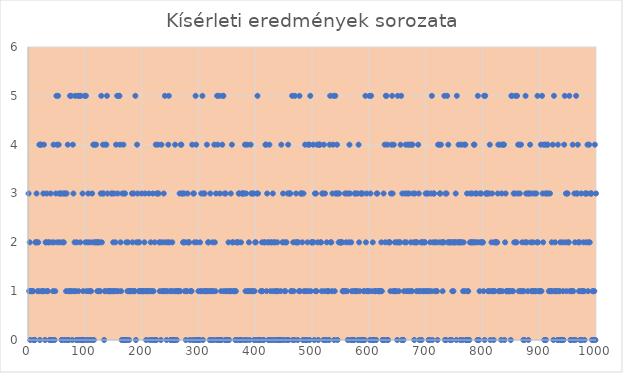
| Category | Series 0 |
|---|---|
| 1.0 | 3 |
| 2.0 | 1 |
| 3.0 | 2 |
| 4.0 | 0 |
| 5.0 | 1 |
| 6.0 | 1 |
| 7.0 | 1 |
| 8.0 | 1 |
| 9.0 | 1 |
| 10.0 | 0 |
| 11.0 | 0 |
| 12.0 | 0 |
| 13.0 | 2 |
| 14.0 | 2 |
| 15.0 | 3 |
| 16.0 | 2 |
| 17.0 | 1 |
| 18.0 | 2 |
| 19.0 | 1 |
| 20.0 | 4 |
| 21.0 | 0 |
| 22.0 | 4 |
| 23.0 | 4 |
| 24.0 | 1 |
| 25.0 | 1 |
| 26.0 | 1 |
| 27.0 | 3 |
| 28.0 | 4 |
| 29.0 | 1 |
| 30.0 | 0 |
| 31.0 | 2 |
| 32.0 | 2 |
| 33.0 | 3 |
| 34.0 | 1 |
| 35.0 | 1 |
| 36.0 | 2 |
| 37.0 | 2 |
| 38.0 | 0 |
| 39.0 | 0 |
| 40.0 | 3 |
| 41.0 | 0 |
| 42.0 | 2 |
| 43.0 | 0 |
| 44.0 | 1 |
| 45.0 | 4 |
| 46.0 | 2 |
| 47.0 | 0 |
| 48.0 | 1 |
| 49.0 | 3 |
| 50.0 | 5 |
| 51.0 | 4 |
| 52.0 | 2 |
| 53.0 | 5 |
| 54.0 | 4 |
| 55.0 | 3 |
| 56.0 | 2 |
| 57.0 | 3 |
| 58.0 | 3 |
| 59.0 | 0 |
| 60.0 | 0 |
| 61.0 | 2 |
| 62.0 | 3 |
| 63.0 | 2 |
| 64.0 | 3 |
| 65.0 | 0 |
| 66.0 | 3 |
| 67.0 | 1 |
| 68.0 | 3 |
| 69.0 | 0 |
| 70.0 | 4 |
| 71.0 | 1 |
| 72.0 | 0 |
| 73.0 | 1 |
| 74.0 | 5 |
| 75.0 | 1 |
| 76.0 | 5 |
| 77.0 | 1 |
| 78.0 | 0 |
| 79.0 | 4 |
| 80.0 | 3 |
| 81.0 | 1 |
| 82.0 | 2 |
| 83.0 | 5 |
| 84.0 | 1 |
| 85.0 | 0 |
| 86.0 | 2 |
| 87.0 | 0 |
| 88.0 | 5 |
| 89.0 | 1 |
| 90.0 | 0 |
| 91.0 | 5 |
| 92.0 | 2 |
| 93.0 | 5 |
| 94.0 | 0 |
| 95.0 | 0 |
| 96.0 | 3 |
| 97.0 | 1 |
| 98.0 | 0 |
| 99.0 | 0 |
| 100.0 | 5 |
| 101.0 | 2 |
| 102.0 | 5 |
| 103.0 | 1 |
| 104.0 | 0 |
| 105.0 | 2 |
| 106.0 | 3 |
| 107.0 | 1 |
| 108.0 | 0 |
| 109.0 | 2 |
| 110.0 | 1 |
| 111.0 | 1 |
| 112.0 | 0 |
| 113.0 | 3 |
| 114.0 | 2 |
| 115.0 | 4 |
| 116.0 | 0 |
| 117.0 | 4 |
| 118.0 | 2 |
| 119.0 | 2 |
| 120.0 | 4 |
| 121.0 | 2 |
| 122.0 | 1 |
| 123.0 | 2 |
| 124.0 | 2 |
| 125.0 | 1 |
| 126.0 | 2 |
| 127.0 | 1 |
| 128.0 | 3 |
| 129.0 | 5 |
| 130.0 | 2 |
| 131.0 | 3 |
| 132.0 | 4 |
| 133.0 | 3 |
| 134.0 | 0 |
| 135.0 | 1 |
| 136.0 | 4 |
| 137.0 | 1 |
| 138.0 | 4 |
| 139.0 | 5 |
| 140.0 | 3 |
| 141.0 | 1 |
| 142.0 | 1 |
| 143.0 | 1 |
| 144.0 | 1 |
| 145.0 | 1 |
| 146.0 | 1 |
| 147.0 | 3 |
| 148.0 | 3 |
| 149.0 | 1 |
| 150.0 | 2 |
| 151.0 | 1 |
| 152.0 | 3 |
| 153.0 | 1 |
| 154.0 | 2 |
| 155.0 | 4 |
| 156.0 | 1 |
| 157.0 | 5 |
| 158.0 | 3 |
| 159.0 | 1 |
| 160.0 | 5 |
| 161.0 | 5 |
| 162.0 | 4 |
| 163.0 | 2 |
| 164.0 | 1 |
| 165.0 | 0 |
| 166.0 | 3 |
| 167.0 | 0 |
| 168.0 | 4 |
| 169.0 | 3 |
| 170.0 | 0 |
| 171.0 | 3 |
| 172.0 | 0 |
| 173.0 | 2 |
| 174.0 | 0 |
| 175.0 | 1 |
| 176.0 | 2 |
| 177.0 | 1 |
| 178.0 | 0 |
| 179.0 | 1 |
| 180.0 | 1 |
| 181.0 | 1 |
| 182.0 | 1 |
| 183.0 | 3 |
| 184.0 | 2 |
| 185.0 | 1 |
| 186.0 | 3 |
| 187.0 | 1 |
| 188.0 | 1 |
| 189.0 | 5 |
| 190.0 | 0 |
| 191.0 | 2 |
| 192.0 | 4 |
| 193.0 | 3 |
| 194.0 | 2 |
| 195.0 | 1 |
| 196.0 | 2 |
| 197.0 | 1 |
| 198.0 | 1 |
| 199.0 | 1 |
| 200.0 | 3 |
| 201.0 | 1 |
| 202.0 | 1 |
| 203.0 | 1 |
| 204.0 | 1 |
| 205.0 | 2 |
| 206.0 | 3 |
| 207.0 | 1 |
| 208.0 | 0 |
| 209.0 | 1 |
| 210.0 | 1 |
| 211.0 | 1 |
| 212.0 | 1 |
| 213.0 | 3 |
| 214.0 | 0 |
| 215.0 | 1 |
| 216.0 | 2 |
| 217.0 | 1 |
| 218.0 | 0 |
| 219.0 | 1 |
| 220.0 | 3 |
| 221.0 | 1 |
| 222.0 | 0 |
| 223.0 | 2 |
| 224.0 | 0 |
| 225.0 | 4 |
| 226.0 | 0 |
| 227.0 | 3 |
| 228.0 | 3 |
| 229.0 | 4 |
| 230.0 | 3 |
| 231.0 | 2 |
| 232.0 | 1 |
| 233.0 | 2 |
| 234.0 | 0 |
| 235.0 | 4 |
| 236.0 | 1 |
| 237.0 | 2 |
| 238.0 | 1 |
| 239.0 | 3 |
| 240.0 | 1 |
| 241.0 | 5 |
| 242.0 | 2 |
| 243.0 | 1 |
| 244.0 | 0 |
| 245.0 | 1 |
| 246.0 | 2 |
| 247.0 | 4 |
| 248.0 | 5 |
| 249.0 | 2 |
| 250.0 | 1 |
| 251.0 | 0 |
| 252.0 | 0 |
| 253.0 | 1 |
| 254.0 | 2 |
| 255.0 | 0 |
| 256.0 | 1 |
| 257.0 | 0 |
| 258.0 | 0 |
| 259.0 | 4 |
| 260.0 | 1 |
| 261.0 | 1 |
| 262.0 | 0 |
| 263.0 | 1 |
| 264.0 | 1 |
| 265.0 | 1 |
| 266.0 | 1 |
| 267.0 | 3 |
| 268.0 | 1 |
| 269.0 | 4 |
| 270.0 | 4 |
| 271.0 | 3 |
| 272.0 | 3 |
| 273.0 | 2 |
| 274.0 | 2 |
| 275.0 | 3 |
| 276.0 | 1 |
| 277.0 | 2 |
| 278.0 | 0 |
| 279.0 | 1 |
| 280.0 | 1 |
| 281.0 | 3 |
| 282.0 | 2 |
| 283.0 | 2 |
| 284.0 | 2 |
| 285.0 | 0 |
| 286.0 | 1 |
| 287.0 | 1 |
| 288.0 | 1 |
| 289.0 | 4 |
| 290.0 | 0 |
| 291.0 | 3 |
| 292.0 | 3 |
| 293.0 | 2 |
| 294.0 | 0 |
| 295.0 | 5 |
| 296.0 | 4 |
| 297.0 | 2 |
| 298.0 | 0 |
| 299.0 | 0 |
| 300.0 | 1 |
| 301.0 | 0 |
| 302.0 | 0 |
| 303.0 | 2 |
| 304.0 | 1 |
| 305.0 | 3 |
| 306.0 | 1 |
| 307.0 | 5 |
| 308.0 | 0 |
| 309.0 | 3 |
| 310.0 | 1 |
| 311.0 | 3 |
| 312.0 | 1 |
| 313.0 | 1 |
| 314.0 | 1 |
| 315.0 | 4 |
| 316.0 | 1 |
| 317.0 | 2 |
| 318.0 | 2 |
| 319.0 | 1 |
| 320.0 | 0 |
| 321.0 | 3 |
| 322.0 | 1 |
| 323.0 | 0 |
| 324.0 | 1 |
| 325.0 | 2 |
| 326.0 | 1 |
| 327.0 | 0 |
| 328.0 | 4 |
| 329.0 | 2 |
| 330.0 | 1 |
| 331.0 | 3 |
| 332.0 | 0 |
| 333.0 | 5 |
| 334.0 | 4 |
| 335.0 | 0 |
| 336.0 | 0 |
| 337.0 | 5 |
| 338.0 | 3 |
| 339.0 | 0 |
| 340.0 | 1 |
| 341.0 | 0 |
| 342.0 | 4 |
| 343.0 | 5 |
| 344.0 | 5 |
| 345.0 | 1 |
| 346.0 | 3 |
| 347.0 | 0 |
| 348.0 | 3 |
| 349.0 | 1 |
| 350.0 | 0 |
| 351.0 | 1 |
| 352.0 | 0 |
| 353.0 | 2 |
| 354.0 | 0 |
| 355.0 | 1 |
| 356.0 | 1 |
| 357.0 | 3 |
| 358.0 | 1 |
| 359.0 | 4 |
| 360.0 | 2 |
| 361.0 | 2 |
| 362.0 | 1 |
| 363.0 | 1 |
| 364.0 | 1 |
| 365.0 | 0 |
| 366.0 | 1 |
| 367.0 | 2 |
| 368.0 | 0 |
| 369.0 | 2 |
| 370.0 | 2 |
| 371.0 | 3 |
| 372.0 | 3 |
| 373.0 | 0 |
| 374.0 | 0 |
| 375.0 | 2 |
| 376.0 | 0 |
| 377.0 | 3 |
| 378.0 | 3 |
| 379.0 | 3 |
| 380.0 | 3 |
| 381.0 | 0 |
| 382.0 | 4 |
| 383.0 | 1 |
| 384.0 | 3 |
| 385.0 | 0 |
| 386.0 | 4 |
| 387.0 | 1 |
| 388.0 | 1 |
| 389.0 | 2 |
| 390.0 | 0 |
| 391.0 | 1 |
| 392.0 | 4 |
| 393.0 | 3 |
| 394.0 | 1 |
| 395.0 | 3 |
| 396.0 | 1 |
| 397.0 | 3 |
| 398.0 | 0 |
| 399.0 | 1 |
| 400.0 | 2 |
| 401.0 | 2 |
| 402.0 | 0 |
| 403.0 | 3 |
| 404.0 | 5 |
| 405.0 | 3 |
| 406.0 | 0 |
| 407.0 | 0 |
| 408.0 | 0 |
| 409.0 | 0 |
| 410.0 | 1 |
| 411.0 | 1 |
| 412.0 | 2 |
| 413.0 | 1 |
| 414.0 | 0 |
| 415.0 | 0 |
| 416.0 | 2 |
| 417.0 | 2 |
| 418.0 | 4 |
| 419.0 | 4 |
| 420.0 | 1 |
| 421.0 | 3 |
| 422.0 | 2 |
| 423.0 | 0 |
| 424.0 | 2 |
| 425.0 | 4 |
| 426.0 | 0 |
| 427.0 | 1 |
| 428.0 | 2 |
| 429.0 | 2 |
| 430.0 | 0 |
| 431.0 | 3 |
| 432.0 | 1 |
| 433.0 | 2 |
| 434.0 | 0 |
| 435.0 | 2 |
| 436.0 | 1 |
| 437.0 | 0 |
| 438.0 | 1 |
| 439.0 | 2 |
| 440.0 | 1 |
| 441.0 | 0 |
| 442.0 | 0 |
| 443.0 | 0 |
| 444.0 | 0 |
| 445.0 | 1 |
| 446.0 | 4 |
| 447.0 | 0 |
| 448.0 | 2 |
| 449.0 | 3 |
| 450.0 | 2 |
| 451.0 | 0 |
| 452.0 | 1 |
| 453.0 | 1 |
| 454.0 | 2 |
| 455.0 | 2 |
| 456.0 | 0 |
| 457.0 | 3 |
| 458.0 | 4 |
| 459.0 | 0 |
| 460.0 | 3 |
| 461.0 | 3 |
| 462.0 | 3 |
| 463.0 | 1 |
| 464.0 | 1 |
| 465.0 | 5 |
| 466.0 | 0 |
| 467.0 | 2 |
| 468.0 | 1 |
| 469.0 | 0 |
| 470.0 | 5 |
| 471.0 | 2 |
| 472.0 | 3 |
| 473.0 | 2 |
| 474.0 | 2 |
| 475.0 | 0 |
| 476.0 | 2 |
| 477.0 | 1 |
| 478.0 | 5 |
| 479.0 | 1 |
| 480.0 | 3 |
| 481.0 | 3 |
| 482.0 | 3 |
| 483.0 | 2 |
| 484.0 | 0 |
| 485.0 | 3 |
| 486.0 | 1 |
| 487.0 | 0 |
| 488.0 | 4 |
| 489.0 | 1 |
| 490.0 | 0 |
| 491.0 | 0 |
| 492.0 | 2 |
| 493.0 | 1 |
| 494.0 | 4 |
| 495.0 | 4 |
| 496.0 | 0 |
| 497.0 | 5 |
| 498.0 | 1 |
| 499.0 | 2 |
| 500.0 | 2 |
| 501.0 | 2 |
| 502.0 | 4 |
| 503.0 | 2 |
| 504.0 | 0 |
| 505.0 | 3 |
| 506.0 | 1 |
| 507.0 | 3 |
| 508.0 | 1 |
| 509.0 | 4 |
| 510.0 | 2 |
| 511.0 | 0 |
| 512.0 | 4 |
| 513.0 | 4 |
| 514.0 | 4 |
| 515.0 | 2 |
| 516.0 | 2 |
| 517.0 | 1 |
| 518.0 | 3 |
| 519.0 | 3 |
| 520.0 | 0 |
| 521.0 | 4 |
| 522.0 | 1 |
| 523.0 | 3 |
| 524.0 | 0 |
| 525.0 | 0 |
| 526.0 | 2 |
| 527.0 | 1 |
| 528.0 | 1 |
| 529.0 | 1 |
| 530.0 | 0 |
| 531.0 | 4 |
| 532.0 | 5 |
| 533.0 | 2 |
| 534.0 | 2 |
| 535.0 | 1 |
| 536.0 | 3 |
| 537.0 | 4 |
| 538.0 | 5 |
| 539.0 | 0 |
| 540.0 | 1 |
| 541.0 | 5 |
| 542.0 | 3 |
| 543.0 | 3 |
| 544.0 | 4 |
| 545.0 | 0 |
| 546.0 | 3 |
| 547.0 | 2 |
| 548.0 | 3 |
| 549.0 | 2 |
| 550.0 | 2 |
| 551.0 | 2 |
| 552.0 | 2 |
| 553.0 | 2 |
| 554.0 | 1 |
| 555.0 | 1 |
| 556.0 | 1 |
| 557.0 | 1 |
| 558.0 | 3 |
| 559.0 | 1 |
| 560.0 | 2 |
| 561.0 | 3 |
| 562.0 | 1 |
| 563.0 | 0 |
| 564.0 | 3 |
| 565.0 | 2 |
| 566.0 | 4 |
| 567.0 | 3 |
| 568.0 | 0 |
| 569.0 | 2 |
| 570.0 | 1 |
| 571.0 | 0 |
| 572.0 | 0 |
| 573.0 | 1 |
| 574.0 | 0 |
| 575.0 | 3 |
| 576.0 | 1 |
| 577.0 | 3 |
| 578.0 | 1 |
| 579.0 | 1 |
| 580.0 | 3 |
| 581.0 | 0 |
| 582.0 | 4 |
| 583.0 | 2 |
| 584.0 | 1 |
| 585.0 | 0 |
| 586.0 | 3 |
| 587.0 | 3 |
| 588.0 | 0 |
| 589.0 | 3 |
| 590.0 | 0 |
| 591.0 | 1 |
| 592.0 | 1 |
| 593.0 | 0 |
| 594.0 | 5 |
| 595.0 | 2 |
| 596.0 | 3 |
| 597.0 | 1 |
| 598.0 | 1 |
| 599.0 | 1 |
| 600.0 | 1 |
| 601.0 | 5 |
| 602.0 | 0 |
| 603.0 | 3 |
| 604.0 | 5 |
| 605.0 | 1 |
| 606.0 | 0 |
| 607.0 | 2 |
| 608.0 | 0 |
| 609.0 | 0 |
| 610.0 | 1 |
| 611.0 | 1 |
| 612.0 | 1 |
| 613.0 | 0 |
| 614.0 | 3 |
| 615.0 | 3 |
| 616.0 | 1 |
| 617.0 | 1 |
| 618.0 | 1 |
| 619.0 | 1 |
| 620.0 | 1 |
| 621.0 | 1 |
| 622.0 | 2 |
| 623.0 | 1 |
| 624.0 | 0 |
| 625.0 | 0 |
| 626.0 | 3 |
| 627.0 | 0 |
| 628.0 | 4 |
| 629.0 | 2 |
| 630.0 | 5 |
| 631.0 | 5 |
| 632.0 | 0 |
| 633.0 | 4 |
| 634.0 | 0 |
| 635.0 | 2 |
| 636.0 | 2 |
| 637.0 | 2 |
| 638.0 | 1 |
| 639.0 | 3 |
| 640.0 | 4 |
| 641.0 | 5 |
| 642.0 | 3 |
| 643.0 | 1 |
| 644.0 | 4 |
| 645.0 | 1 |
| 646.0 | 2 |
| 647.0 | 1 |
| 648.0 | 1 |
| 649.0 | 2 |
| 650.0 | 0 |
| 651.0 | 5 |
| 652.0 | 2 |
| 653.0 | 1 |
| 654.0 | 2 |
| 655.0 | 2 |
| 656.0 | 4 |
| 657.0 | 5 |
| 658.0 | 0 |
| 659.0 | 3 |
| 660.0 | 0 |
| 661.0 | 0 |
| 662.0 | 1 |
| 663.0 | 2 |
| 664.0 | 3 |
| 665.0 | 4 |
| 666.0 | 2 |
| 667.0 | 1 |
| 668.0 | 3 |
| 669.0 | 4 |
| 670.0 | 1 |
| 671.0 | 3 |
| 672.0 | 4 |
| 673.0 | 1 |
| 674.0 | 2 |
| 675.0 | 4 |
| 676.0 | 1 |
| 677.0 | 4 |
| 678.0 | 3 |
| 679.0 | 2 |
| 680.0 | 0 |
| 681.0 | 3 |
| 682.0 | 2 |
| 683.0 | 2 |
| 684.0 | 1 |
| 685.0 | 2 |
| 686.0 | 1 |
| 687.0 | 4 |
| 688.0 | 3 |
| 689.0 | 0 |
| 690.0 | 1 |
| 691.0 | 1 |
| 692.0 | 2 |
| 693.0 | 0 |
| 694.0 | 2 |
| 695.0 | 2 |
| 696.0 | 1 |
| 697.0 | 1 |
| 698.0 | 2 |
| 699.0 | 2 |
| 700.0 | 3 |
| 701.0 | 1 |
| 702.0 | 3 |
| 703.0 | 1 |
| 704.0 | 3 |
| 705.0 | 0 |
| 706.0 | 1 |
| 707.0 | 0 |
| 708.0 | 2 |
| 709.0 | 3 |
| 710.0 | 1 |
| 711.0 | 5 |
| 712.0 | 0 |
| 713.0 | 2 |
| 714.0 | 3 |
| 715.0 | 3 |
| 716.0 | 1 |
| 717.0 | 2 |
| 718.0 | 2 |
| 719.0 | 1 |
| 720.0 | 1 |
| 721.0 | 0 |
| 722.0 | 4 |
| 723.0 | 2 |
| 724.0 | 4 |
| 725.0 | 3 |
| 726.0 | 3 |
| 727.0 | 4 |
| 728.0 | 2 |
| 729.0 | 2 |
| 730.0 | 1 |
| 731.0 | 2 |
| 732.0 | 2 |
| 733.0 | 5 |
| 734.0 | 0 |
| 735.0 | 3 |
| 736.0 | 0 |
| 737.0 | 3 |
| 738.0 | 5 |
| 739.0 | 2 |
| 740.0 | 4 |
| 741.0 | 2 |
| 742.0 | 2 |
| 743.0 | 0 |
| 744.0 | 2 |
| 745.0 | 2 |
| 746.0 | 0 |
| 747.0 | 1 |
| 748.0 | 2 |
| 749.0 | 1 |
| 750.0 | 2 |
| 751.0 | 2 |
| 752.0 | 2 |
| 753.0 | 3 |
| 754.0 | 0 |
| 755.0 | 5 |
| 756.0 | 2 |
| 757.0 | 2 |
| 758.0 | 4 |
| 759.0 | 2 |
| 760.0 | 2 |
| 761.0 | 0 |
| 762.0 | 2 |
| 763.0 | 4 |
| 764.0 | 2 |
| 765.0 | 0 |
| 766.0 | 1 |
| 767.0 | 2 |
| 768.0 | 4 |
| 769.0 | 1 |
| 770.0 | 4 |
| 771.0 | 0 |
| 772.0 | 0 |
| 773.0 | 3 |
| 774.0 | 1 |
| 775.0 | 1 |
| 776.0 | 0 |
| 777.0 | 0 |
| 778.0 | 2 |
| 779.0 | 3 |
| 780.0 | 2 |
| 781.0 | 2 |
| 782.0 | 3 |
| 783.0 | 2 |
| 784.0 | 2 |
| 785.0 | 4 |
| 786.0 | 4 |
| 787.0 | 2 |
| 788.0 | 3 |
| 789.0 | 2 |
| 790.0 | 3 |
| 791.0 | 0 |
| 792.0 | 5 |
| 793.0 | 2 |
| 794.0 | 0 |
| 795.0 | 1 |
| 796.0 | 3 |
| 797.0 | 2 |
| 798.0 | 3 |
| 799.0 | 2 |
| 800.0 | 2 |
| 801.0 | 2 |
| 802.0 | 1 |
| 803.0 | 5 |
| 804.0 | 0 |
| 805.0 | 5 |
| 806.0 | 3 |
| 807.0 | 3 |
| 808.0 | 3 |
| 809.0 | 3 |
| 810.0 | 1 |
| 811.0 | 1 |
| 812.0 | 3 |
| 813.0 | 4 |
| 814.0 | 0 |
| 815.0 | 1 |
| 816.0 | 2 |
| 817.0 | 3 |
| 818.0 | 1 |
| 819.0 | 1 |
| 820.0 | 0 |
| 821.0 | 2 |
| 822.0 | 1 |
| 823.0 | 2 |
| 824.0 | 2 |
| 825.0 | 2 |
| 826.0 | 2 |
| 827.0 | 3 |
| 828.0 | 4 |
| 829.0 | 1 |
| 830.0 | 1 |
| 831.0 | 1 |
| 832.0 | 4 |
| 833.0 | 0 |
| 834.0 | 3 |
| 835.0 | 1 |
| 836.0 | 4 |
| 837.0 | 4 |
| 838.0 | 4 |
| 839.0 | 0 |
| 840.0 | 2 |
| 841.0 | 3 |
| 842.0 | 1 |
| 843.0 | 1 |
| 844.0 | 1 |
| 845.0 | 1 |
| 846.0 | 1 |
| 847.0 | 1 |
| 848.0 | 1 |
| 849.0 | 1 |
| 850.0 | 0 |
| 851.0 | 5 |
| 852.0 | 5 |
| 853.0 | 1 |
| 854.0 | 1 |
| 855.0 | 3 |
| 856.0 | 2 |
| 857.0 | 3 |
| 858.0 | 5 |
| 859.0 | 2 |
| 860.0 | 2 |
| 861.0 | 5 |
| 862.0 | 3 |
| 863.0 | 4 |
| 864.0 | 1 |
| 865.0 | 4 |
| 866.0 | 3 |
| 867.0 | 1 |
| 868.0 | 4 |
| 869.0 | 1 |
| 870.0 | 2 |
| 871.0 | 1 |
| 872.0 | 0 |
| 873.0 | 1 |
| 874.0 | 0 |
| 875.0 | 2 |
| 876.0 | 5 |
| 877.0 | 3 |
| 878.0 | 2 |
| 879.0 | 3 |
| 880.0 | 1 |
| 881.0 | 0 |
| 882.0 | 3 |
| 883.0 | 3 |
| 884.0 | 4 |
| 885.0 | 2 |
| 886.0 | 1 |
| 887.0 | 3 |
| 888.0 | 1 |
| 889.0 | 2 |
| 890.0 | 1 |
| 891.0 | 1 |
| 892.0 | 3 |
| 893.0 | 1 |
| 894.0 | 1 |
| 895.0 | 3 |
| 896.0 | 2 |
| 897.0 | 5 |
| 898.0 | 2 |
| 899.0 | 1 |
| 900.0 | 1 |
| 901.0 | 1 |
| 902.0 | 1 |
| 903.0 | 4 |
| 904.0 | 1 |
| 905.0 | 5 |
| 906.0 | 3 |
| 907.0 | 2 |
| 908.0 | 4 |
| 909.0 | 0 |
| 910.0 | 4 |
| 911.0 | 3 |
| 912.0 | 0 |
| 913.0 | 3 |
| 914.0 | 4 |
| 915.0 | 4 |
| 916.0 | 3 |
| 917.0 | 1 |
| 918.0 | 1 |
| 919.0 | 3 |
| 920.0 | 1 |
| 921.0 | 1 |
| 922.0 | 2 |
| 923.0 | 1 |
| 924.0 | 4 |
| 925.0 | 0 |
| 926.0 | 5 |
| 927.0 | 1 |
| 928.0 | 2 |
| 929.0 | 1 |
| 930.0 | 1 |
| 931.0 | 1 |
| 932.0 | 0 |
| 933.0 | 4 |
| 934.0 | 0 |
| 935.0 | 1 |
| 936.0 | 1 |
| 937.0 | 2 |
| 938.0 | 0 |
| 939.0 | 0 |
| 940.0 | 0 |
| 941.0 | 2 |
| 942.0 | 1 |
| 943.0 | 0 |
| 944.0 | 4 |
| 945.0 | 5 |
| 946.0 | 2 |
| 947.0 | 3 |
| 948.0 | 1 |
| 949.0 | 3 |
| 950.0 | 3 |
| 951.0 | 2 |
| 952.0 | 2 |
| 953.0 | 5 |
| 954.0 | 1 |
| 955.0 | 0 |
| 956.0 | 0 |
| 957.0 | 1 |
| 958.0 | 1 |
| 959.0 | 4 |
| 960.0 | 1 |
| 961.0 | 0 |
| 962.0 | 3 |
| 963.0 | 2 |
| 964.0 | 0 |
| 965.0 | 5 |
| 966.0 | 3 |
| 967.0 | 3 |
| 968.0 | 4 |
| 969.0 | 2 |
| 970.0 | 1 |
| 971.0 | 2 |
| 972.0 | 0 |
| 973.0 | 1 |
| 974.0 | 3 |
| 975.0 | 0 |
| 976.0 | 1 |
| 977.0 | 1 |
| 978.0 | 2 |
| 979.0 | 1 |
| 980.0 | 0 |
| 981.0 | 3 |
| 982.0 | 3 |
| 983.0 | 2 |
| 984.0 | 3 |
| 985.0 | 4 |
| 986.0 | 1 |
| 987.0 | 2 |
| 988.0 | 4 |
| 989.0 | 2 |
| 990.0 | 3 |
| 991.0 | 3 |
| 992.0 | 3 |
| 993.0 | 0 |
| 994.0 | 1 |
| 995.0 | 1 |
| 996.0 | 0 |
| 997.0 | 1 |
| 998.0 | 4 |
| 999.0 | 0 |
| 1000.0 | 3 |